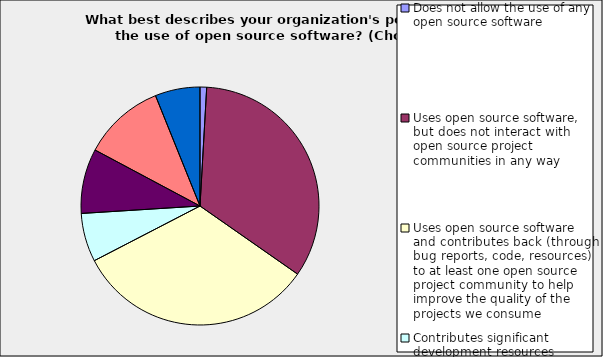
| Category | Series 0 |
|---|---|
| Does not allow the use of any open source software | 0.009 |
| Uses open source software, but does not interact with open source project communities in any way | 0.338 |
| Uses open source software and contributes back (through bug reports, code, resources) to at least one open source project community to help improve the quality of the projects we consume | 0.327 |
| Contributes significant development resources (contributors, committers and/or maintainers, project leaders) to at least one open source project community in order to help influence the evolution of the projects we consume | 0.066 |
| Has a business model that relies on open source software for its success | 0.088 |
| Individual, not affiliated with an organization | 0.111 |
| Don't know | 0.061 |